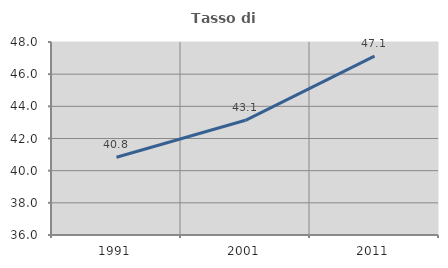
| Category | Tasso di occupazione   |
|---|---|
| 1991.0 | 40.832 |
| 2001.0 | 43.131 |
| 2011.0 | 47.126 |